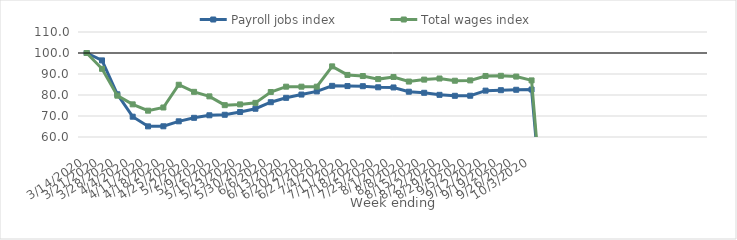
| Category | Payroll jobs index | Total wages index |
|---|---|---|
| 14/03/2020 | 100 | 100 |
| 21/03/2020 | 96.479 | 92.466 |
| 28/03/2020 | 80.337 | 79.676 |
| 04/04/2020 | 69.669 | 75.544 |
| 11/04/2020 | 65.065 | 72.541 |
| 18/04/2020 | 65.099 | 74.049 |
| 25/04/2020 | 67.464 | 84.877 |
| 02/05/2020 | 69.136 | 81.508 |
| 09/05/2020 | 70.348 | 79.346 |
| 16/05/2020 | 70.587 | 75.162 |
| 23/05/2020 | 71.91 | 75.524 |
| 30/05/2020 | 73.455 | 76.254 |
| 06/06/2020 | 76.57 | 81.421 |
| 13/06/2020 | 78.652 | 83.964 |
| 20/06/2020 | 80.215 | 83.965 |
| 27/06/2020 | 81.711 | 83.963 |
| 04/07/2020 | 84.358 | 93.632 |
| 11/07/2020 | 84.249 | 89.556 |
| 18/07/2020 | 84.194 | 89.026 |
| 25/07/2020 | 83.669 | 87.569 |
| 01/08/2020 | 83.592 | 88.596 |
| 08/08/2020 | 81.562 | 86.402 |
| 15/08/2020 | 81.05 | 87.329 |
| 22/08/2020 | 80.077 | 87.845 |
| 29/08/2020 | 79.616 | 86.796 |
| 05/09/2020 | 79.649 | 86.959 |
| 12/09/2020 | 82.078 | 89.055 |
| 19/09/2020 | 82.291 | 89.138 |
| 26/09/2020 | 82.486 | 88.785 |
| 03/10/2020 | 82.612 | 86.954 |